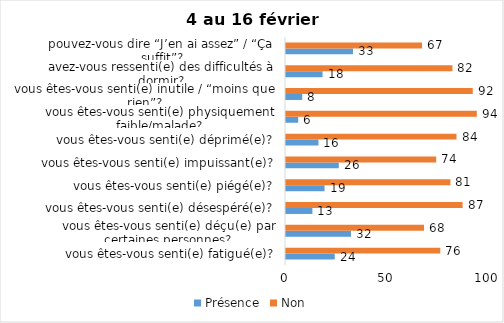
| Category | Présence | Non |
|---|---|---|
| vous êtes-vous senti(e) fatigué(e)? | 24 | 76 |
| vous êtes-vous senti(e) déçu(e) par certaines personnes? | 32 | 68 |
| vous êtes-vous senti(e) désespéré(e)? | 13 | 87 |
| vous êtes-vous senti(e) piégé(e)? | 19 | 81 |
| vous êtes-vous senti(e) impuissant(e)? | 26 | 74 |
| vous êtes-vous senti(e) déprimé(e)? | 16 | 84 |
| vous êtes-vous senti(e) physiquement faible/malade? | 6 | 94 |
| vous êtes-vous senti(e) inutile / “moins que rien”? | 8 | 92 |
| avez-vous ressenti(e) des difficultés à dormir? | 18 | 82 |
| pouvez-vous dire “J’en ai assez” / “Ça suffit”? | 33 | 67 |